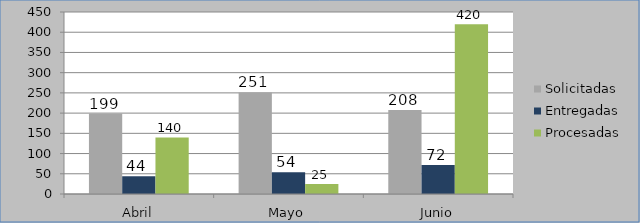
| Category | Solicitadas | Entregadas | Procesadas |
|---|---|---|---|
| Abril | 199 | 44 | 140 |
| Mayo | 251 | 54 | 25 |
| Junio | 208 | 72 | 420 |